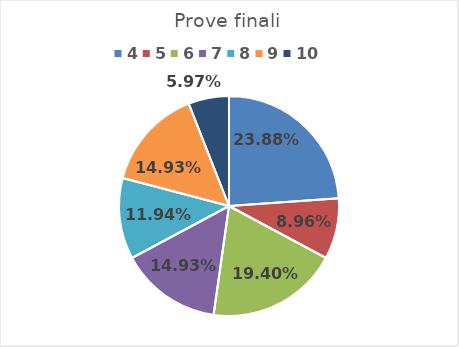
| Category | Series 0 |
|---|---|
| 4.0 | 0.239 |
| 5.0 | 0.09 |
| 6.0 | 0.194 |
| 7.0 | 0.149 |
| 8.0 | 0.119 |
| 9.0 | 0.149 |
| 10.0 | 0.06 |